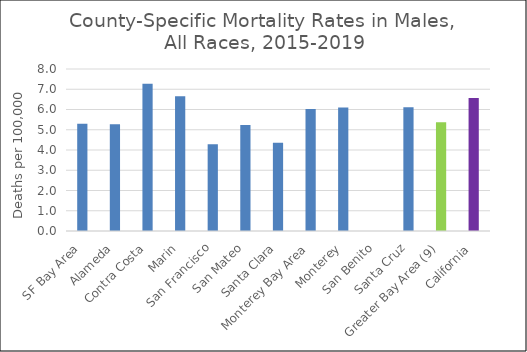
| Category | Male |
|---|---|
| SF Bay Area | 5.3 |
|   Alameda | 5.27 |
|   Contra Costa | 7.27 |
|   Marin | 6.65 |
|   San Francisco | 4.28 |
|   San Mateo | 5.24 |
|   Santa Clara | 4.36 |
| Monterey Bay Area | 6.03 |
|   Monterey | 6.1 |
|   San Benito | 0 |
|   Santa Cruz | 6.11 |
| Greater Bay Area (9) | 5.37 |
| California | 6.57 |